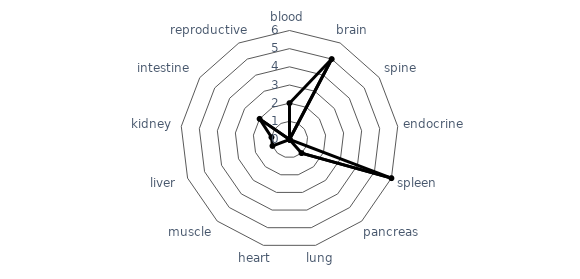
| Category | Series 0 |
|---|---|
| blood | 2 |
| brain | 5 |
| spine | 0 |
| endocrine | 0 |
| spleen | 6 |
| pancreas | 1 |
| lung | 0 |
| heart | 0 |
| muscle | 0 |
| liver | 1 |
| kidney | 1 |
| intestine | 2 |
| reproductive | 0 |